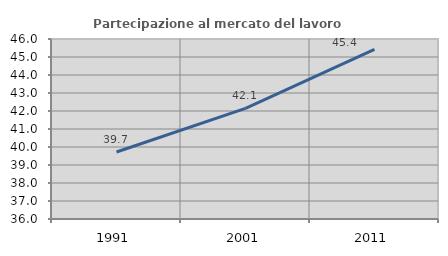
| Category | Partecipazione al mercato del lavoro  femminile |
|---|---|
| 1991.0 | 39.721 |
| 2001.0 | 42.149 |
| 2011.0 | 45.42 |